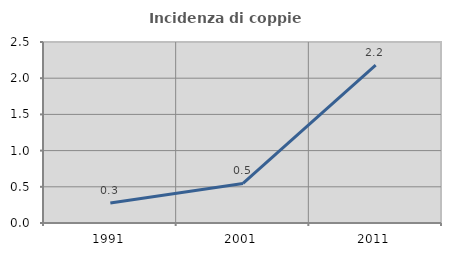
| Category | Incidenza di coppie miste |
|---|---|
| 1991.0 | 0.276 |
| 2001.0 | 0.547 |
| 2011.0 | 2.18 |